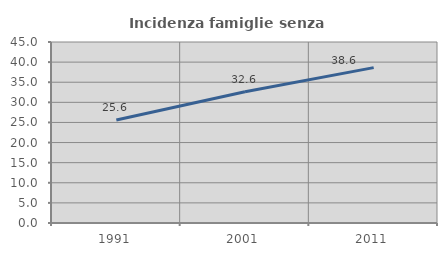
| Category | Incidenza famiglie senza nuclei |
|---|---|
| 1991.0 | 25.617 |
| 2001.0 | 32.621 |
| 2011.0 | 38.624 |